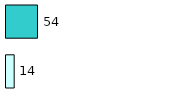
| Category | Series 0 | Series 1 |
|---|---|---|
| 0 | 14 | 54 |